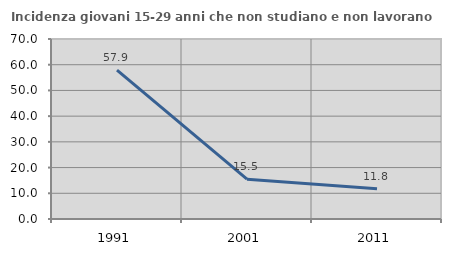
| Category | Incidenza giovani 15-29 anni che non studiano e non lavorano  |
|---|---|
| 1991.0 | 57.864 |
| 2001.0 | 15.472 |
| 2011.0 | 11.785 |